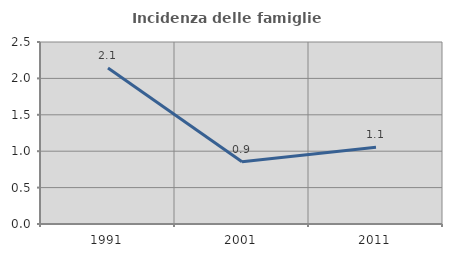
| Category | Incidenza delle famiglie numerose |
|---|---|
| 1991.0 | 2.142 |
| 2001.0 | 0.854 |
| 2011.0 | 1.054 |